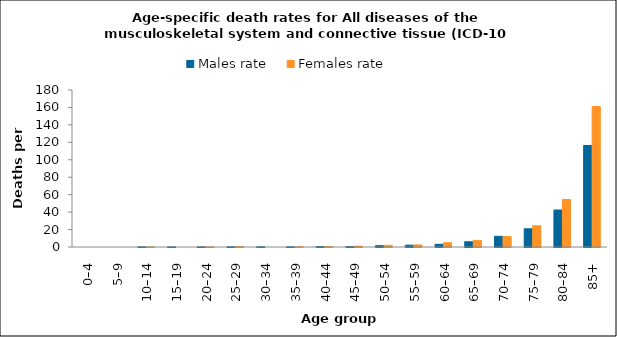
| Category | Males rate | Females rate |
|---|---|---|
| 0–4 | 0 | 0 |
| 5–9 | 0 | 0 |
| 10–14 | 0.12 | 0.127 |
| 15–19 | 0.131 | 0 |
| 20–24 | 0.119 | 0.127 |
| 25–29 | 0.218 | 0.553 |
| 30–34 | 0.213 | 0 |
| 35–39 | 0.108 | 0.213 |
| 40–44 | 0.49 | 0.477 |
| 45–49 | 0.489 | 0.961 |
| 50–54 | 1.511 | 1.957 |
| 55–59 | 2.098 | 2.411 |
| 60–64 | 3.093 | 4.908 |
| 65–69 | 5.992 | 7.546 |
| 70–74 | 12.259 | 11.992 |
| 75–79 | 20.885 | 24.323 |
| 80–84 | 42.406 | 54.494 |
| 85+ | 116.37 | 161.011 |